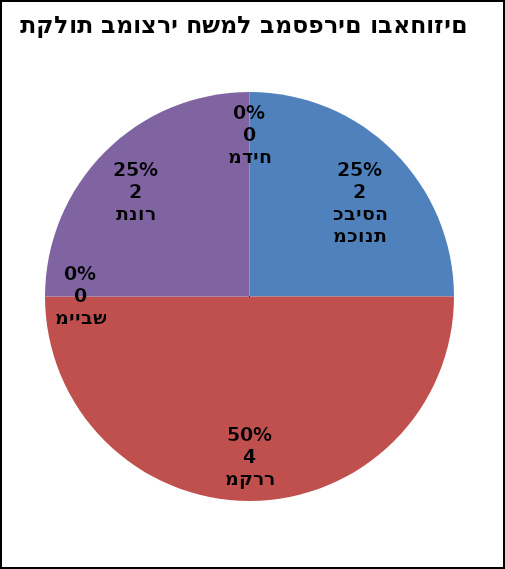
| Category | Series 0 |
|---|---|
| מכונת כביסה | 2 |
| מקרר | 4 |
| מייבש | 0 |
| תנור | 2 |
| מדיח | 0 |